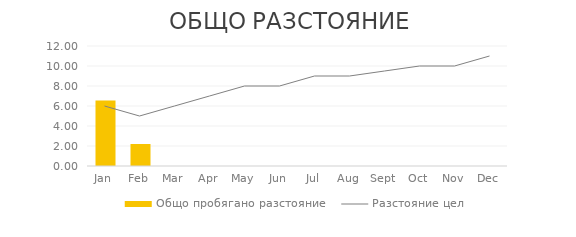
| Category | Общо пробягано разстояние |
|---|---|
| 2012-01-01 | 6.55 |
| 2012-02-01 | 2.2 |
| 2012-03-01 | 0 |
| 2012-04-01 | 0 |
| 2012-05-01 | 0 |
| 2012-06-01 | 0 |
| 2012-07-01 | 0 |
| 2012-08-01 | 0 |
| 2012-09-01 | 0 |
| 2012-10-01 | 0 |
| 2012-11-01 | 0 |
| 2012-12-01 | 0 |